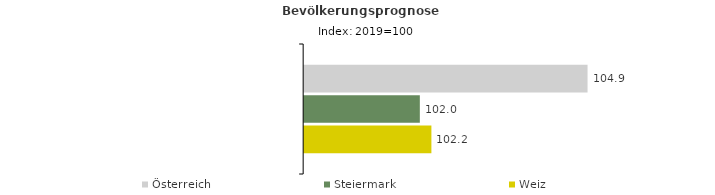
| Category | Österreich | Steiermark | Weiz |
|---|---|---|---|
| 2019.0 | 104.9 | 102 | 102.2 |